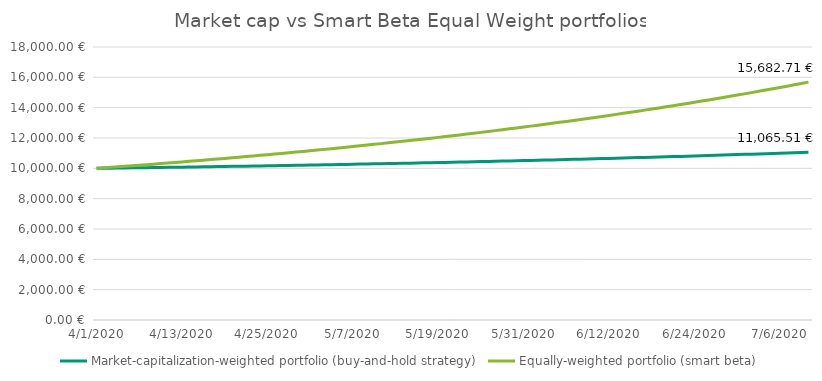
| Category | Equally-weighted portfolio (smart beta) | Market-capitalization-weighted portfolio (buy-and-hold strategy) |
|---|---|---|
| 4/1/20 | 10000 | 10000 |
| 4/2/20 | 10033.333 | 10006.25 |
| 4/3/20 | 10067 | 10012.562 |
| 4/4/20 | 10101.003 | 10018.938 |
| 4/5/20 | 10135.347 | 10025.378 |
| 4/6/20 | 10170.034 | 10031.881 |
| 4/7/20 | 10205.067 | 10038.45 |
| 4/8/20 | 10240.451 | 10045.085 |
| 4/9/20 | 10276.189 | 10051.785 |
| 4/10/20 | 10312.284 | 10058.553 |
| 4/11/20 | 10348.74 | 10065.389 |
| 4/12/20 | 10385.561 | 10072.293 |
| 4/13/20 | 10422.75 | 10079.266 |
| 4/14/20 | 10460.311 | 10086.308 |
| 4/15/20 | 10498.247 | 10093.421 |
| 4/16/20 | 10536.563 | 10100.606 |
| 4/17/20 | 10575.262 | 10107.862 |
| 4/18/20 | 10614.348 | 10115.19 |
| 4/19/20 | 10653.825 | 10122.592 |
| 4/20/20 | 10693.697 | 10130.068 |
| 4/21/20 | 10733.967 | 10137.619 |
| 4/22/20 | 10774.64 | 10145.245 |
| 4/23/20 | 10815.72 | 10152.947 |
| 4/24/20 | 10857.21 | 10160.727 |
| 4/25/20 | 10899.115 | 10168.584 |
| 4/26/20 | 10941.44 | 10176.52 |
| 4/27/20 | 10984.188 | 10184.535 |
| 4/28/20 | 11027.363 | 10192.631 |
| 4/29/20 | 11070.97 | 10200.807 |
| 4/30/20 | 11115.013 | 10209.065 |
| 5/1/20 | 11159.496 | 10217.406 |
| 5/2/20 | 11204.425 | 10225.83 |
| 5/3/20 | 11249.802 | 10234.338 |
| 5/4/20 | 11295.634 | 10242.931 |
| 5/5/20 | 11341.923 | 10251.611 |
| 5/6/20 | 11388.676 | 10260.377 |
| 5/7/20 | 11435.896 | 10269.23 |
| 5/8/20 | 11483.588 | 10278.173 |
| 5/9/20 | 11531.757 | 10287.205 |
| 5/10/20 | 11580.408 | 10296.327 |
| 5/11/20 | 11629.546 | 10305.54 |
| 5/12/20 | 11679.175 | 10314.845 |
| 5/13/20 | 11729.3 | 10324.244 |
| 5/14/20 | 11779.926 | 10333.736 |
| 5/15/20 | 11831.059 | 10343.323 |
| 5/16/20 | 11882.702 | 10353.007 |
| 5/17/20 | 11934.863 | 10362.787 |
| 5/18/20 | 11987.545 | 10372.665 |
| 5/19/20 | 12040.754 | 10382.641 |
| 5/20/20 | 12094.494 | 10392.718 |
| 5/21/20 | 12148.773 | 10402.895 |
| 5/22/20 | 12203.594 | 10413.174 |
| 5/23/20 | 12258.963 | 10423.556 |
| 5/24/20 | 12314.886 | 10434.041 |
| 5/25/20 | 12371.368 | 10444.632 |
| 5/26/20 | 12428.415 | 10455.328 |
| 5/27/20 | 12486.033 | 10466.131 |
| 5/28/20 | 12544.226 | 10477.042 |
| 5/29/20 | 12603.002 | 10488.063 |
| 5/30/20 | 12662.365 | 10499.194 |
| 5/31/20 | 12722.322 | 10510.435 |
| 6/1/20 | 12782.879 | 10521.79 |
| 6/2/20 | 12844.041 | 10533.258 |
| 6/3/20 | 12905.815 | 10544.84 |
| 6/4/20 | 12968.206 | 10556.539 |
| 6/5/20 | 13031.222 | 10568.354 |
| 6/6/20 | 13094.867 | 10580.288 |
| 6/7/20 | 13159.149 | 10592.34 |
| 6/8/20 | 13224.074 | 10604.514 |
| 6/9/20 | 13289.648 | 10616.809 |
| 6/10/20 | 13355.878 | 10629.227 |
| 6/11/20 | 13422.77 | 10641.769 |
| 6/12/20 | 13490.331 | 10654.437 |
| 6/13/20 | 13558.568 | 10667.231 |
| 6/14/20 | 13627.487 | 10680.154 |
| 6/15/20 | 13697.095 | 10693.205 |
| 6/16/20 | 13767.399 | 10706.387 |
| 6/17/20 | 13838.407 | 10719.701 |
| 6/18/20 | 13910.124 | 10733.148 |
| 6/19/20 | 13982.558 | 10746.73 |
| 6/20/20 | 14055.717 | 10760.447 |
| 6/21/20 | 14129.608 | 10774.301 |
| 6/22/20 | 14204.237 | 10788.294 |
| 6/23/20 | 14279.613 | 10802.427 |
| 6/24/20 | 14355.742 | 10816.702 |
| 6/25/20 | 14432.633 | 10831.119 |
| 6/26/20 | 14510.293 | 10845.68 |
| 6/27/20 | 14588.729 | 10860.387 |
| 6/28/20 | 14667.95 | 10875.241 |
| 6/29/20 | 14747.963 | 10890.243 |
| 6/30/20 | 14828.776 | 10905.395 |
| 7/1/20 | 14910.397 | 10920.699 |
| 7/2/20 | 14992.834 | 10936.156 |
| 7/3/20 | 15076.096 | 10951.768 |
| 7/4/20 | 15160.19 | 10967.536 |
| 7/5/20 | 15245.125 | 10983.461 |
| 7/6/20 | 15330.91 | 10999.546 |
| 7/7/20 | 15417.552 | 11015.791 |
| 7/8/20 | 15505.061 | 11032.199 |
| 7/9/20 | 15593.445 | 11048.771 |
| 7/10/20 | 15682.713 | 11065.509 |